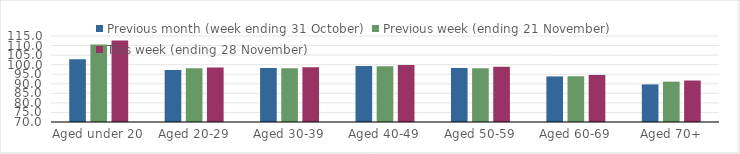
| Category | Previous month (week ending 31 October) | Previous week (ending 21 November) | This week (ending 28 November) |
|---|---|---|---|
| Aged under 20 | 102.89 | 110.56 | 112.71 |
| Aged 20-29 | 97.23 | 98.18 | 98.56 |
| Aged 30-39 | 98.2 | 98.11 | 98.62 |
| Aged 40-49 | 99.26 | 99.19 | 99.87 |
| Aged 50-59 | 98.22 | 98.16 | 98.93 |
| Aged 60-69 | 93.86 | 93.94 | 94.62 |
| Aged 70+ | 89.67 | 91.13 | 91.71 |